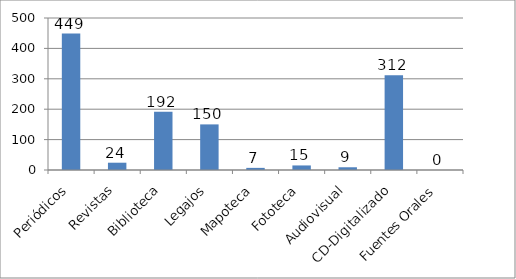
| Category | Series 0 |
|---|---|
| Periódicos | 449 |
| Revistas | 24 |
| Biblioteca | 192 |
| Legajos | 150 |
| Mapoteca | 7 |
| Fototeca | 15 |
| Audiovisual | 9 |
| CD-Digitalizado | 312 |
| Fuentes Orales | 0 |